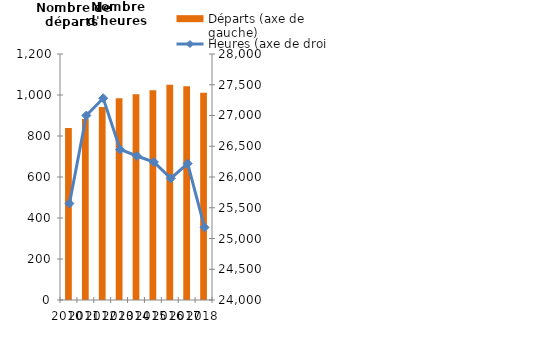
| Category | Départs (axe de gauche) |
|---|---|
| 2010.0 | 838.642 |
| 2011.0 | 882.318 |
| 2012.0 | 941.368 |
| 2013.0 | 983.932 |
| 2014.0 | 1004.207 |
| 2015.0 | 1023 |
| 2016.0 | 1050.4 |
| 2017.0 | 1042.3 |
| 2018.0 | 1010.57 |